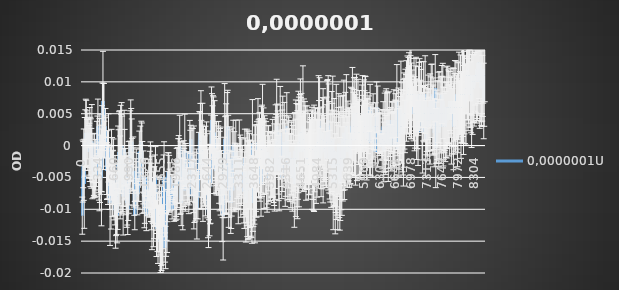
| Category | 0,0000001U |
|---|---|
| 0.0 | -0.011 |
| 11.0 | -0.004 |
| 22.0 | -0.003 |
| 33.0 | -0.003 |
| 44.0 | -0.006 |
| 54.0 | 0 |
| 65.0 | 0.001 |
| 76.0 | 0.002 |
| 87.0 | 0.002 |
| 97.0 | 0.001 |
| 108.0 | 0.001 |
| 119.0 | 0.001 |
| 129.0 | 0.002 |
| 139.0 | -0.001 |
| 150.0 | -0.001 |
| 161.0 | 0 |
| 172.0 | -0.001 |
| 182.0 | 0 |
| 192.0 | -0.002 |
| 202.0 | 0.001 |
| 213.0 | -0.004 |
| 224.0 | -0.002 |
| 235.0 | -0.005 |
| 246.0 | -0.004 |
| 257.0 | -0.003 |
| 268.0 | -0.004 |
| 279.0 | -0.003 |
| 290.0 | -0.005 |
| 301.0 | -0.004 |
| 312.0 | -0.001 |
| 323.0 | 0.001 |
| 334.0 | 0.003 |
| 344.0 | -0.004 |
| 354.0 | -0.004 |
| 365.0 | -0.003 |
| 375.0 | -0.002 |
| 385.0 | -0.003 |
| 395.0 | -0.002 |
| 406.0 | -0.005 |
| 416.0 | 0 |
| 427.0 | 0.004 |
| 438.0 | 0.007 |
| 449.0 | 0.003 |
| 459.0 | 0.005 |
| 470.0 | 0.001 |
| 480.0 | 0.003 |
| 490.0 | 0.003 |
| 500.0 | 0.001 |
| 511.0 | -0.004 |
| 522.0 | -0.004 |
| 533.0 | -0.003 |
| 543.0 | -0.004 |
| 553.0 | 0 |
| 564.0 | -0.003 |
| 574.0 | -0.006 |
| 586.0 | -0.009 |
| 597.0 | -0.004 |
| 607.0 | -0.008 |
| 617.0 | -0.003 |
| 628.0 | -0.004 |
| 638.0 | -0.006 |
| 649.0 | -0.005 |
| 660.0 | -0.004 |
| 671.0 | -0.008 |
| 682.0 | -0.007 |
| 694.0 | -0.007 |
| 705.0 | -0.011 |
| 715.0 | -0.009 |
| 726.0 | -0.009 |
| 738.0 | -0.011 |
| 748.0 | -0.008 |
| 758.0 | -0.003 |
| 768.0 | -0.004 |
| 779.0 | -0.001 |
| 790.0 | -0.002 |
| 800.0 | -0.005 |
| 811.0 | -0.001 |
| 822.0 | -0.003 |
| 832.0 | 0 |
| 842.0 | -0.003 |
| 853.0 | -0.006 |
| 863.0 | -0.008 |
| 874.0 | -0.005 |
| 885.0 | 0 |
| 896.0 | -0.003 |
| 907.0 | -0.005 |
| 918.0 | -0.005 |
| 928.0 | -0.006 |
| 938.0 | -0.009 |
| 949.0 | -0.007 |
| 959.0 | -0.01 |
| 969.0 | -0.007 |
| 979.0 | -0.005 |
| 990.0 | -0.006 |
| 1001.0 | -0.003 |
| 1012.0 | 0 |
| 1023.0 | 0 |
| 1033.0 | 0 |
| 1045.0 | 0.001 |
| 1056.0 | -0.003 |
| 1066.0 | -0.004 |
| 1077.0 | -0.004 |
| 1088.0 | -0.005 |
| 1098.0 | -0.009 |
| 1109.0 | -0.011 |
| 1120.0 | -0.004 |
| 1130.0 | -0.006 |
| 1141.0 | -0.005 |
| 1151.0 | -0.005 |
| 1162.0 | -0.008 |
| 1173.0 | -0.008 |
| 1184.0 | -0.007 |
| 1195.0 | -0.005 |
| 1207.0 | -0.001 |
| 1217.0 | -0.003 |
| 1228.0 | -0.001 |
| 1239.0 | -0.003 |
| 1250.0 | 0.001 |
| 1260.0 | 0.001 |
| 1271.0 | -0.005 |
| 1282.0 | -0.005 |
| 1292.0 | -0.005 |
| 1303.0 | -0.009 |
| 1314.0 | -0.009 |
| 1326.0 | -0.01 |
| 1336.0 | -0.005 |
| 1346.0 | -0.008 |
| 1357.0 | -0.011 |
| 1368.0 | -0.009 |
| 1379.0 | -0.007 |
| 1390.0 | -0.007 |
| 1400.0 | -0.009 |
| 1410.0 | -0.006 |
| 1421.0 | -0.007 |
| 1432.0 | -0.006 |
| 1443.0 | -0.005 |
| 1454.0 | -0.006 |
| 1465.0 | -0.008 |
| 1476.0 | -0.009 |
| 1486.0 | -0.009 |
| 1496.0 | -0.009 |
| 1507.0 | -0.01 |
| 1517.0 | -0.009 |
| 1527.0 | -0.008 |
| 1538.0 | -0.007 |
| 1549.0 | -0.005 |
| 1560.0 | -0.01 |
| 1570.0 | -0.013 |
| 1580.0 | -0.01 |
| 1591.0 | -0.012 |
| 1601.0 | -0.013 |
| 1612.0 | -0.012 |
| 1622.0 | -0.011 |
| 1633.0 | -0.011 |
| 1644.0 | -0.015 |
| 1655.0 | -0.014 |
| 1666.0 | -0.013 |
| 1677.0 | -0.013 |
| 1688.0 | -0.013 |
| 1699.0 | -0.014 |
| 1710.0 | -0.016 |
| 1721.0 | -0.007 |
| 1732.0 | -0.005 |
| 1743.0 | -0.01 |
| 1753.0 | -0.016 |
| 1763.0 | -0.016 |
| 1774.0 | -0.014 |
| 1784.0 | -0.011 |
| 1794.0 | -0.011 |
| 1804.0 | -0.008 |
| 1814.0 | -0.004 |
| 1825.0 | -0.006 |
| 1836.0 | -0.006 |
| 1847.0 | -0.007 |
| 1859.0 | -0.005 |
| 1870.0 | -0.009 |
| 1880.0 | -0.008 |
| 1891.0 | -0.006 |
| 1902.0 | -0.01 |
| 1912.0 | -0.006 |
| 1922.0 | -0.008 |
| 1933.0 | -0.008 |
| 1944.0 | -0.008 |
| 1954.0 | -0.008 |
| 1965.0 | -0.006 |
| 1975.0 | -0.007 |
| 1986.0 | -0.008 |
| 1996.0 | -0.006 |
| 2007.0 | -0.006 |
| 2017.0 | -0.005 |
| 2028.0 | -0.002 |
| 2039.0 | -0.002 |
| 2049.0 | -0.004 |
| 2060.0 | 0 |
| 2070.0 | -0.006 |
| 2081.0 | -0.005 |
| 2091.0 | -0.009 |
| 2102.0 | -0.006 |
| 2112.0 | -0.004 |
| 2123.0 | -0.007 |
| 2133.0 | -0.006 |
| 2144.0 | -0.003 |
| 2154.0 | -0.005 |
| 2164.0 | -0.001 |
| 2175.0 | -0.007 |
| 2186.0 | -0.003 |
| 2197.0 | -0.005 |
| 2208.0 | -0.006 |
| 2218.0 | -0.005 |
| 2229.0 | -0.005 |
| 2239.0 | -0.006 |
| 2251.0 | -0.008 |
| 2262.0 | -0.006 |
| 2272.0 | -0.001 |
| 2283.0 | -0.002 |
| 2295.0 | 0.001 |
| 2306.0 | -0.005 |
| 2317.0 | -0.003 |
| 2327.0 | -0.005 |
| 2338.0 | -0.002 |
| 2349.0 | -0.006 |
| 2359.0 | -0.005 |
| 2370.0 | -0.008 |
| 2380.0 | -0.005 |
| 2391.0 | -0.007 |
| 2401.0 | -0.007 |
| 2411.0 | -0.006 |
| 2422.0 | -0.01 |
| 2432.0 | -0.007 |
| 2443.0 | -0.008 |
| 2454.0 | -0.005 |
| 2465.0 | -0.003 |
| 2476.0 | 0.001 |
| 2486.0 | 0.002 |
| 2497.0 | 0.001 |
| 2507.0 | -0.001 |
| 2518.0 | -0.003 |
| 2529.0 | -0.002 |
| 2539.0 | -0.001 |
| 2550.0 | -0.006 |
| 2560.0 | -0.003 |
| 2571.0 | -0.003 |
| 2582.0 | -0.004 |
| 2593.0 | -0.005 |
| 2603.0 | -0.004 |
| 2614.0 | -0.004 |
| 2624.0 | -0.002 |
| 2634.0 | -0.004 |
| 2644.0 | -0.006 |
| 2655.0 | -0.009 |
| 2666.0 | -0.011 |
| 2677.0 | -0.006 |
| 2687.0 | -0.007 |
| 2698.0 | -0.005 |
| 2709.0 | -0.006 |
| 2720.0 | -0.001 |
| 2730.0 | 0.004 |
| 2741.0 | 0.003 |
| 2752.0 | 0 |
| 2762.0 | 0.003 |
| 2773.0 | 0.002 |
| 2783.0 | -0.002 |
| 2794.0 | 0.002 |
| 2804.0 | 0 |
| 2815.0 | -0.004 |
| 2826.0 | -0.003 |
| 2836.0 | -0.002 |
| 2847.0 | -0.003 |
| 2858.0 | -0.003 |
| 2868.0 | -0.001 |
| 2879.0 | -0.002 |
| 2891.0 | -0.005 |
| 2902.0 | -0.004 |
| 2913.0 | -0.002 |
| 2924.0 | -0.004 |
| 2935.0 | -0.006 |
| 2946.0 | -0.005 |
| 2957.0 | -0.009 |
| 2968.0 | -0.008 |
| 2979.0 | -0.011 |
| 2990.0 | -0.006 |
| 3000.0 | -0.005 |
| 3012.0 | 0.001 |
| 3023.0 | -0.002 |
| 3033.0 | -0.003 |
| 3044.0 | -0.002 |
| 3054.0 | -0.007 |
| 3064.0 | 0 |
| 3075.0 | 0.003 |
| 3086.0 | -0.002 |
| 3097.0 | -0.007 |
| 3107.0 | -0.006 |
| 3117.0 | -0.002 |
| 3127.0 | -0.002 |
| 3138.0 | -0.008 |
| 3149.0 | -0.009 |
| 3159.0 | -0.006 |
| 3170.0 | -0.003 |
| 3181.0 | -0.007 |
| 3191.0 | 0 |
| 3202.0 | -0.006 |
| 3214.0 | -0.002 |
| 3225.0 | -0.005 |
| 3235.0 | -0.005 |
| 3245.0 | -0.001 |
| 3256.0 | -0.005 |
| 3268.0 | -0.005 |
| 3279.0 | -0.004 |
| 3290.0 | -0.005 |
| 3300.0 | -0.007 |
| 3311.0 | -0.005 |
| 3321.0 | -0.002 |
| 3333.0 | -0.006 |
| 3345.0 | -0.003 |
| 3355.0 | -0.005 |
| 3366.0 | -0.005 |
| 3376.0 | -0.004 |
| 3387.0 | -0.002 |
| 3398.0 | -0.006 |
| 3409.0 | -0.007 |
| 3420.0 | -0.007 |
| 3430.0 | -0.007 |
| 3441.0 | -0.004 |
| 3453.0 | -0.005 |
| 3464.0 | -0.009 |
| 3474.0 | -0.006 |
| 3485.0 | -0.005 |
| 3495.0 | -0.006 |
| 3506.0 | -0.007 |
| 3516.0 | -0.007 |
| 3527.0 | -0.006 |
| 3538.0 | -0.004 |
| 3549.0 | -0.006 |
| 3561.0 | -0.006 |
| 3572.0 | -0.007 |
| 3583.0 | -0.008 |
| 3595.0 | -0.009 |
| 3606.0 | 0 |
| 3617.0 | -0.007 |
| 3627.0 | -0.006 |
| 3638.0 | -0.005 |
| 3648.0 | -0.007 |
| 3659.0 | -0.006 |
| 3669.0 | -0.004 |
| 3680.0 | -0.005 |
| 3691.0 | -0.006 |
| 3701.0 | -0.001 |
| 3712.0 | -0.002 |
| 3722.0 | 0 |
| 3733.0 | -0.002 |
| 3744.0 | -0.002 |
| 3756.0 | 0.001 |
| 3766.0 | -0.004 |
| 3777.0 | -0.002 |
| 3788.0 | -0.006 |
| 3799.0 | -0.001 |
| 3809.0 | -0.001 |
| 3820.0 | 0.003 |
| 3830.0 | -0.002 |
| 3841.0 | 0 |
| 3852.0 | -0.003 |
| 3863.0 | 0 |
| 3874.0 | -0.001 |
| 3884.0 | -0.003 |
| 3895.0 | -0.001 |
| 3906.0 | -0.005 |
| 3917.0 | -0.005 |
| 3927.0 | -0.001 |
| 3938.0 | -0.003 |
| 3949.0 | -0.002 |
| 3961.0 | -0.004 |
| 3972.0 | -0.002 |
| 3982.0 | -0.002 |
| 3993.0 | -0.004 |
| 4004.0 | -0.003 |
| 4015.0 | -0.004 |
| 4025.0 | -0.003 |
| 4036.0 | -0.002 |
| 4047.0 | -0.003 |
| 4058.0 | -0.004 |
| 4069.0 | -0.003 |
| 4080.0 | -0.004 |
| 4091.0 | -0.002 |
| 4102.0 | 0 |
| 4113.0 | 0 |
| 4123.0 | 0.003 |
| 4134.0 | 0.001 |
| 4145.0 | 0 |
| 4156.0 | -0.003 |
| 4167.0 | -0.002 |
| 4177.0 | -0.004 |
| 4188.0 | 0 |
| 4200.0 | 0.002 |
| 4210.0 | 0.001 |
| 4221.0 | -0.002 |
| 4231.0 | -0.005 |
| 4241.0 | 0 |
| 4252.0 | 0 |
| 4262.0 | -0.001 |
| 4273.0 | 0.001 |
| 4283.0 | 0.001 |
| 4294.0 | 0 |
| 4305.0 | -0.003 |
| 4316.0 | -0.003 |
| 4327.0 | -0.002 |
| 4337.0 | 0.003 |
| 4348.0 | -0.003 |
| 4359.0 | -0.001 |
| 4369.0 | -0.001 |
| 4380.0 | -0.002 |
| 4391.0 | -0.001 |
| 4401.0 | -0.004 |
| 4412.0 | -0.002 |
| 4423.0 | -0.004 |
| 4434.0 | -0.002 |
| 4445.0 | -0.002 |
| 4456.0 | -0.005 |
| 4467.0 | -0.002 |
| 4478.0 | -0.002 |
| 4488.0 | -0.003 |
| 4499.0 | -0.006 |
| 4511.0 | -0.001 |
| 4522.0 | -0.002 |
| 4532.0 | -0.002 |
| 4543.0 | 0 |
| 4554.0 | -0.004 |
| 4565.0 | -0.003 |
| 4576.0 | -0.001 |
| 4586.0 | 0.001 |
| 4597.0 | -0.001 |
| 4607.0 | 0 |
| 4619.0 | 0.002 |
| 4630.0 | 0.002 |
| 4641.0 | 0 |
| 4651.0 | 0.002 |
| 4662.0 | -0.001 |
| 4673.0 | -0.001 |
| 4683.0 | 0.003 |
| 4694.0 | 0.001 |
| 4704.0 | 0 |
| 4714.0 | -0.001 |
| 4725.0 | 0 |
| 4736.0 | 0 |
| 4747.0 | -0.003 |
| 4757.0 | -0.002 |
| 4768.0 | 0 |
| 4778.0 | -0.002 |
| 4789.0 | 0 |
| 4800.0 | -0.003 |
| 4810.0 | -0.002 |
| 4821.0 | 0 |
| 4832.0 | -0.002 |
| 4844.0 | -0.001 |
| 4854.0 | -0.001 |
| 4866.0 | 0 |
| 4877.0 | -0.002 |
| 4888.0 | -0.001 |
| 4899.0 | -0.003 |
| 4909.0 | -0.003 |
| 4920.0 | -0.002 |
| 4930.0 | -0.001 |
| 4941.0 | -0.002 |
| 4952.0 | 0 |
| 4963.0 | -0.002 |
| 4973.0 | -0.001 |
| 4984.0 | -0.002 |
| 4995.0 | 0 |
| 5006.0 | -0.001 |
| 5017.0 | 0.004 |
| 5027.0 | 0.002 |
| 5038.0 | 0.003 |
| 5048.0 | 0.001 |
| 5058.0 | -0.002 |
| 5069.0 | -0.002 |
| 5079.0 | 0.001 |
| 5089.0 | 0 |
| 5100.0 | 0.002 |
| 5112.0 | 0 |
| 5123.0 | 0.001 |
| 5133.0 | -0.001 |
| 5143.0 | 0 |
| 5153.0 | -0.001 |
| 5163.0 | -0.002 |
| 5174.0 | 0 |
| 5184.0 | 0 |
| 5196.0 | 0.003 |
| 5207.0 | 0.004 |
| 5218.0 | 0.002 |
| 5228.0 | 0.003 |
| 5239.0 | 0 |
| 5251.0 | -0.003 |
| 5262.0 | -0.002 |
| 5273.0 | -0.001 |
| 5283.0 | -0.003 |
| 5293.0 | 0.001 |
| 5304.0 | -0.001 |
| 5315.0 | 0.001 |
| 5325.0 | -0.006 |
| 5335.0 | -0.002 |
| 5346.0 | -0.001 |
| 5357.0 | -0.002 |
| 5367.0 | -0.006 |
| 5377.0 | -0.003 |
| 5387.0 | -0.001 |
| 5398.0 | -0.003 |
| 5409.0 | -0.003 |
| 5419.0 | -0.005 |
| 5430.0 | -0.001 |
| 5440.0 | 0 |
| 5451.0 | -0.003 |
| 5461.0 | -0.006 |
| 5472.0 | -0.002 |
| 5483.0 | -0.002 |
| 5493.0 | -0.002 |
| 5503.0 | -0.004 |
| 5513.0 | 0.001 |
| 5525.0 | -0.002 |
| 5535.0 | 0 |
| 5546.0 | 0.002 |
| 5556.0 | -0.002 |
| 5566.0 | -0.001 |
| 5577.0 | 0.001 |
| 5588.0 | 0 |
| 5598.0 | 0.003 |
| 5609.0 | 0.001 |
| 5619.0 | -0.001 |
| 5629.0 | 0.001 |
| 5639.0 | 0 |
| 5650.0 | 0 |
| 5660.0 | 0 |
| 5670.0 | 0 |
| 5681.0 | -0.002 |
| 5692.0 | 0.003 |
| 5703.0 | 0.001 |
| 5713.0 | 0.002 |
| 5723.0 | 0.004 |
| 5734.0 | 0.001 |
| 5744.0 | 0.003 |
| 5755.0 | 0.005 |
| 5765.0 | 0.002 |
| 5776.0 | 0.003 |
| 5786.0 | 0.001 |
| 5797.0 | 0.002 |
| 5808.0 | 0.005 |
| 5819.0 | 0.001 |
| 5829.0 | 0.003 |
| 5840.0 | 0.005 |
| 5851.0 | 0.002 |
| 5862.0 | 0.001 |
| 5872.0 | 0.002 |
| 5882.0 | -0.001 |
| 5892.0 | 0 |
| 5904.0 | 0 |
| 5915.0 | 0.001 |
| 5926.0 | 0.003 |
| 5937.0 | 0.005 |
| 5947.0 | 0.003 |
| 5957.0 | 0.002 |
| 5969.0 | 0.005 |
| 5980.0 | 0.003 |
| 5991.0 | 0.005 |
| 6002.0 | 0.005 |
| 6012.0 | 0.002 |
| 6023.0 | 0.001 |
| 6034.0 | 0.003 |
| 6044.0 | 0.002 |
| 6054.0 | 0.003 |
| 6065.0 | 0.001 |
| 6075.0 | 0.005 |
| 6086.0 | 0 |
| 6097.0 | 0.006 |
| 6109.0 | 0.001 |
| 6120.0 | 0.003 |
| 6131.0 | 0.001 |
| 6142.0 | 0.002 |
| 6152.0 | 0 |
| 6163.0 | 0.003 |
| 6174.0 | 0.002 |
| 6185.0 | 0.002 |
| 6196.0 | 0.003 |
| 6207.0 | -0.001 |
| 6218.0 | 0.003 |
| 6228.0 | 0.004 |
| 6239.0 | 0.006 |
| 6250.0 | 0.003 |
| 6261.0 | 0.003 |
| 6272.0 | 0.002 |
| 6282.0 | 0.002 |
| 6293.0 | 0.002 |
| 6305.0 | 0.002 |
| 6316.0 | 0.002 |
| 6327.0 | 0 |
| 6337.0 | 0 |
| 6348.0 | 0 |
| 6359.0 | 0.001 |
| 6370.0 | 0.001 |
| 6381.0 | 0.003 |
| 6392.0 | -0.001 |
| 6403.0 | 0.001 |
| 6414.0 | 0.003 |
| 6425.0 | 0 |
| 6437.0 | 0.002 |
| 6448.0 | 0.003 |
| 6460.0 | 0.002 |
| 6471.0 | 0.003 |
| 6482.0 | 0.004 |
| 6492.0 | 0 |
| 6502.0 | 0.001 |
| 6513.0 | 0.004 |
| 6523.0 | 0.002 |
| 6533.0 | 0 |
| 6544.0 | 0.001 |
| 6554.0 | 0.002 |
| 6565.0 | 0.003 |
| 6576.0 | 0.004 |
| 6586.0 | 0.001 |
| 6597.0 | 0.001 |
| 6608.0 | 0.003 |
| 6618.0 | 0 |
| 6630.0 | 0.003 |
| 6641.0 | 0.004 |
| 6652.0 | 0.002 |
| 6663.0 | 0.004 |
| 6673.0 | 0.007 |
| 6684.0 | -0.001 |
| 6694.0 | 0.002 |
| 6705.0 | 0.004 |
| 6716.0 | 0 |
| 6727.0 | 0.002 |
| 6737.0 | 0.002 |
| 6747.0 | 0.003 |
| 6758.0 | 0.006 |
| 6769.0 | 0.003 |
| 6779.0 | 0.005 |
| 6790.0 | 0.002 |
| 6801.0 | 0.002 |
| 6812.0 | 0.002 |
| 6823.0 | 0.004 |
| 6835.0 | 0.005 |
| 6846.0 | 0.003 |
| 6856.0 | 0.007 |
| 6867.0 | 0.007 |
| 6878.0 | 0.007 |
| 6888.0 | 0.007 |
| 6900.0 | 0.008 |
| 6911.0 | 0.007 |
| 6922.0 | 0.009 |
| 6933.0 | 0.009 |
| 6944.0 | 0.007 |
| 6956.0 | 0.011 |
| 6967.0 | 0.008 |
| 6978.0 | 0.009 |
| 6989.0 | 0.007 |
| 7000.0 | 0.008 |
| 7011.0 | 0.008 |
| 7021.0 | 0.007 |
| 7031.0 | 0.005 |
| 7042.0 | 0.008 |
| 7053.0 | 0.005 |
| 7064.0 | 0.005 |
| 7075.0 | 0.007 |
| 7086.0 | 0.008 |
| 7097.0 | 0.004 |
| 7108.0 | 0.005 |
| 7119.0 | 0.004 |
| 7130.0 | 0.002 |
| 7140.0 | 0.007 |
| 7151.0 | 0.008 |
| 7162.0 | 0.008 |
| 7173.0 | 0.006 |
| 7184.0 | 0.007 |
| 7194.0 | 0.007 |
| 7205.0 | 0.008 |
| 7216.0 | 0.003 |
| 7227.0 | 0.002 |
| 7238.0 | 0.005 |
| 7248.0 | 0.008 |
| 7259.0 | 0.005 |
| 7270.0 | 0.005 |
| 7281.0 | 0.008 |
| 7292.0 | 0.001 |
| 7303.0 | 0.003 |
| 7313.0 | 0.004 |
| 7324.0 | 0.003 |
| 7334.0 | 0.004 |
| 7345.0 | 0.006 |
| 7357.0 | 0.004 |
| 7368.0 | 0.004 |
| 7378.0 | 0.003 |
| 7389.0 | 0.007 |
| 7399.0 | 0.005 |
| 7410.0 | 0.007 |
| 7421.0 | 0.005 |
| 7431.0 | 0.008 |
| 7442.0 | 0.004 |
| 7453.0 | 0.004 |
| 7464.0 | 0.005 |
| 7475.0 | 0.002 |
| 7485.0 | 0.003 |
| 7496.0 | 0.009 |
| 7507.0 | 0 |
| 7518.0 | 0.002 |
| 7529.0 | 0.003 |
| 7539.0 | 0.004 |
| 7550.0 | 0.004 |
| 7561.0 | 0.006 |
| 7571.0 | 0.002 |
| 7581.0 | 0.003 |
| 7593.0 | 0.006 |
| 7604.0 | 0.005 |
| 7614.0 | 0.003 |
| 7624.0 | 0.004 |
| 7634.0 | 0.008 |
| 7644.0 | 0.005 |
| 7655.0 | 0.007 |
| 7666.0 | 0.003 |
| 7676.0 | 0.003 |
| 7686.0 | 0.004 |
| 7696.0 | 0.005 |
| 7706.0 | 0.003 |
| 7717.0 | 0.004 |
| 7727.0 | 0.006 |
| 7738.0 | 0.004 |
| 7748.0 | 0.006 |
| 7758.0 | 0.005 |
| 7769.0 | 0.006 |
| 7779.0 | 0.006 |
| 7790.0 | 0.004 |
| 7800.0 | 0.007 |
| 7811.0 | 0.006 |
| 7822.0 | 0.007 |
| 7833.0 | 0.004 |
| 7844.0 | 0.004 |
| 7855.0 | 0.007 |
| 7865.0 | 0.006 |
| 7876.0 | 0.003 |
| 7887.0 | 0.006 |
| 7898.0 | 0.006 |
| 7909.0 | 0.006 |
| 7920.0 | 0.003 |
| 7930.0 | 0.008 |
| 7940.0 | 0.006 |
| 7951.0 | 0.005 |
| 7962.0 | 0.004 |
| 7972.0 | 0.006 |
| 7982.0 | 0.007 |
| 7993.0 | 0.008 |
| 8004.0 | 0.006 |
| 8015.0 | 0.006 |
| 8025.0 | 0.008 |
| 8036.0 | 0.004 |
| 8047.0 | 0.006 |
| 8058.0 | 0.009 |
| 8069.0 | 0.008 |
| 8081.0 | 0.007 |
| 8092.0 | 0.007 |
| 8102.0 | 0.009 |
| 8113.0 | 0.008 |
| 8124.0 | 0.006 |
| 8134.0 | 0.009 |
| 8145.0 | 0.007 |
| 8156.0 | 0.011 |
| 8167.0 | 0.011 |
| 8178.0 | 0.012 |
| 8188.0 | 0.008 |
| 8199.0 | 0.011 |
| 8209.0 | 0.01 |
| 8220.0 | 0.011 |
| 8231.0 | 0.011 |
| 8241.0 | 0.008 |
| 8252.0 | 0.009 |
| 8262.0 | 0.007 |
| 8273.0 | 0.011 |
| 8283.0 | 0.01 |
| 8294.0 | 0.01 |
| 8304.0 | 0.009 |
| 8315.0 | 0.01 |
| 8325.0 | 0.01 |
| 8336.0 | 0.011 |
| 8346.0 | 0.011 |
| 8357.0 | 0.01 |
| 8368.0 | 0.012 |
| 8379.0 | 0.011 |
| 8390.0 | 0.01 |
| 8401.0 | 0.013 |
| 8412.0 | 0.013 |
| 8423.0 | 0.012 |
| 8433.0 | 0.01 |
| 8444.0 | 0.013 |
| 8455.0 | 0.01 |
| 8465.0 | 0.009 |
| 8476.0 | 0.01 |
| 8487.0 | 0.009 |
| 8498.0 | 0.012 |
| 8508.0 | 0.012 |
| 8518.0 | 0.007 |
| 8529.0 | 0.011 |
| 8539.0 | 0.011 |
| 8550.0 | 0.011 |
| 8561.0 | 0.008 |